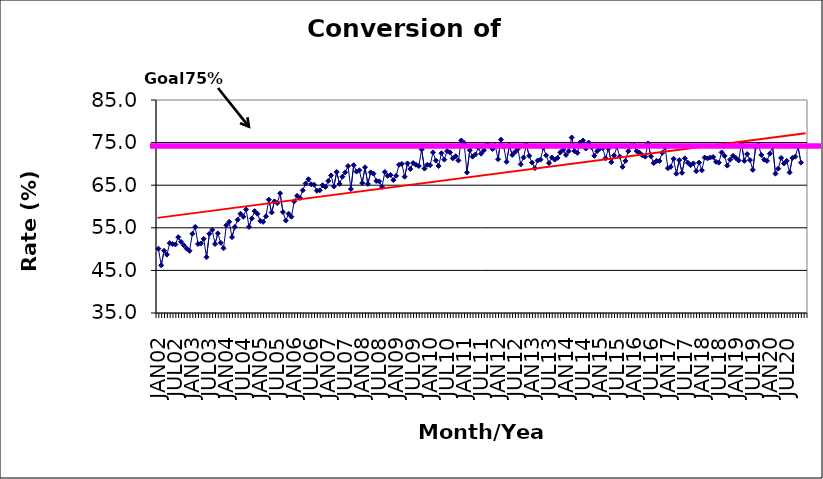
| Category | Series 0 |
|---|---|
| JAN02 | 50.1 |
| FEB02 | 46.2 |
| MAR02 | 49.6 |
| APR02 | 48.7 |
| MAY02 | 51.4 |
| JUN02 | 51.2 |
| JUL02 | 51.1 |
| AUG02 | 52.8 |
| SEP02 | 51.7 |
| OCT02 | 50.9 |
| NOV02 | 50.1 |
| DEC02 | 49.6 |
| JAN03 | 53.6 |
| FEB03 | 55.2 |
| MAR03 | 51.2 |
| APR03 | 51.3 |
| MAY03 | 52.4 |
| JUN03 | 48.1 |
| JUL03 | 53.6 |
| AUG03 | 54.5 |
| SEP03 | 51.2 |
| OCT03 | 53.7 |
| NOV03 | 51.5 |
| DEC03 | 50.2 |
| JAN04 | 55.6 |
| FEB04 | 56.4 |
| MAR04 | 52.8 |
| APR04 | 55.2 |
| MAY04 | 56.9 |
| JUN04 | 58.3 |
| JUL04 | 57.6 |
| AUG04 | 59.3 |
| SEP04 | 55.2 |
| OCT04 | 57.2 |
| NOV04 | 58.9 |
| DEC04 | 58.3 |
| JAN05 | 56.6 |
| FEB05 | 56.4 |
| MAR05 | 57.7 |
| APR05 | 61.6 |
| MAY05 | 58.6 |
| JUN05 | 61.2 |
| JUL05 | 60.8 |
| AUG05 | 63.1 |
| SEP05 | 58.7 |
| OCT05 | 56.7 |
| NOV05 | 58.3 |
| DEC05 | 57.6 |
| JAN06 | 61.2 |
| FEB06 | 62.5 |
| MAR06 | 62 |
| APR06 | 63.8 |
| MAY06 | 65.4 |
| JUN06 | 66.4 |
| JUL06 | 65.2 |
| AUG06 | 65.1 |
| SEP06 | 63.7 |
| OCT06 | 63.8 |
| NOV06 | 65 |
| DEC06 | 64.6 |
| JAN07 | 66 |
| FEB07 | 67.3 |
| MAR07 | 64.7 |
| APR07 | 68.1 |
| MAY07 | 65.3 |
| JUN07 | 67 |
| JUL07 | 68 |
| AUG07 | 69.5 |
| SEP07 | 64.1 |
| OCT07 | 69.7 |
| NOV07 | 68.2 |
| DEC07 | 68.5 |
| JAN08 | 65.5 |
| FEB08 | 69.2 |
| MAR08 | 65.3 |
| APR08 | 68 |
| MAY08 | 67.7 |
| JUN08 | 66 |
| JUL08 | 65.9 |
| AUG08 | 64.6 |
| SEP08 | 68.1 |
| OCT08 | 67.2 |
| NOV08 | 67.4 |
| DEC08 | 66.2 |
| JAN09 | 67.2 |
| FEB09 | 69.8 |
| MAR09 | 70 |
| APR09 | 67 |
| MAY09 | 70.1 |
| JUN09 | 68.8 |
| JUL09 | 70.2 |
| AUG09 | 69.8 |
| SEP09 | 69.5 |
| OCT09 | 73.4 |
| NOV09 | 68.9 |
| DEC09 | 69.8 |
| JAN10 | 69.7 |
| FEB10 | 72.7 |
| MAR10 | 70.8 |
| APR10 | 69.5 |
| MAY10 | 72.5 |
| JUN10 | 71 |
| JUL10 | 73 |
| AUG10 | 72.7 |
| SEP10 | 71.3 |
| OCT10 | 71.8 |
| NOV10 | 70.8 |
| DEC10 | 75.5 |
| JAN11 | 74.9 |
| FEB11 | 68 |
| MAR11 | 73.2 |
| APR11 | 71.7 |
| MAY11 | 72.2 |
| JUN11 | 73.8 |
| JUL11 | 72.4 |
| AUG11 | 73.2 |
| SEP11 | 74.5 |
| OCT11 | 74.3 |
| NOV11 | 73.5 |
| DEC11 | 74.3 |
| JAN12 | 71.1 |
| FEB12 | 75.7 |
| MAR12 | 74.1 |
| APR12 | 70.5 |
| MAY12 | 74.3 |
| JUN12 | 72.1 |
| JUL12 | 72.8 |
| AUG12 | 73.5 |
| SEP12 | 69.9 |
| OCT12 | 71.5 |
| NOV12 | 74.5 |
| DEC12 | 71.9 |
| JAN13 | 70.3 |
| FEB13 | 69 |
| MAR13 | 70.8 |
| APR13 | 71 |
| MAY13 | 73.8 |
| JUN13 | 72 |
| JUL13 | 70.2 |
| AUG13 | 71.5 |
| SEP13 | 71 |
| OCT13 | 71.4 |
| NOV13 | 72.7 |
| DEC13 | 73.3 |
| JAN14 | 72.1 |
| FEB14 | 73 |
| MAR14 | 76.2 |
| APR14 | 73 |
| MAY14 | 72.6 |
| JUN14 | 75 |
| JUL14 | 75.5 |
| AUG14 | 73.6 |
| SEP14 | 75 |
| OCT14 | 73.9 |
| NOV14 | 71.9 |
| DEC14 | 73 |
| JAN15 | 73.6 |
| FEB15 | 73.7 |
| MAR15 | 71.3 |
| APR15 | 73.6 |
| MAY15 | 70.4 |
| JUN15 | 72 |
| JUL15 | 74 |
| AUG15 | 71.7 |
| SEP15 | 69.3 |
| OCT15 | 70.7 |
| NOV15 | 73 |
| DEC15 | 74.2 |
| JAN16 | 74.3 |
| FEB16 | 73 |
| MAR16 | 72.6 |
| APR16 | 72 |
| MAY16 | 71.7 |
| JUN16 | 74.8 |
| JUL16 | 71.8 |
| AUG16 | 70.2 |
| SEP16 | 70.7 |
| OCT16 | 70.7 |
| NOV16 | 72.6 |
| DEC16 | 73.8 |
| JAN17 | 69 |
| FEB17 | 69.3 |
| MAR17 | 71.2 |
| APR17 | 67.7 |
| MAY17 | 70.9 |
| JUN17 | 67.9 |
| JUL17 | 71.3 |
| AUG17 | 70.3 |
| SEP17 | 69.7 |
| OCT17 | 70.1 |
| NOV17 | 68.3 |
| DEC17 | 70.3 |
| JAN18 | 68.5 |
| FEB18 | 71.5 |
| MAR18 | 71.3 |
| APR18 | 71.5 |
| MAY18 | 71.6 |
| JUN18 | 70.5 |
| JUL18 | 70.3 |
| AUG18 | 72.7 |
| SEP18 | 71.9 |
| OCT18 | 69.6 |
| NOV18 | 71 |
| DEC18 | 71.9 |
| JAN19 | 71.4 |
| FEB19 | 70.8 |
| MAR19 | 74.8 |
| APR19 | 70.7 |
| MAY19 | 72.3 |
| JUN19 | 70.9 |
| JUL19 | 68.6 |
| AUG19 | 73.9 |
| SEP19 | 74.5 |
| OCT19 | 72.1 |
| NOV19 | 71 |
| DEC19 | 70.7 |
| JAN20 | 72.4 |
| FEB20 | 74.1 |
| MAR20 | 67.7 |
| APR20 | 68.9 |
| MAY20 | 71.4 |
| JUN20 | 70.1 |
| JUL20 | 70.7 |
| AUG20 | 68 |
| SEP20 | 71.4 |
| OCT20 | 71.7 |
| NOV20 | 74 |
| DEC20 | 70.3 |